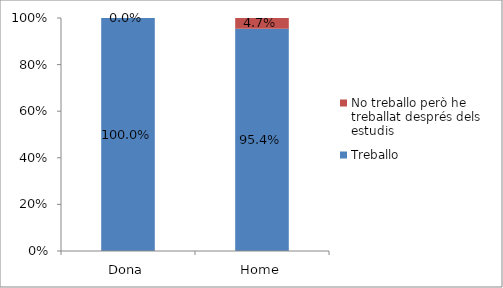
| Category | Treballo | No treballo però he treballat després dels estudis |
|---|---|---|
| Dona | 1 | 0 |
| Home | 0.954 | 0.046 |